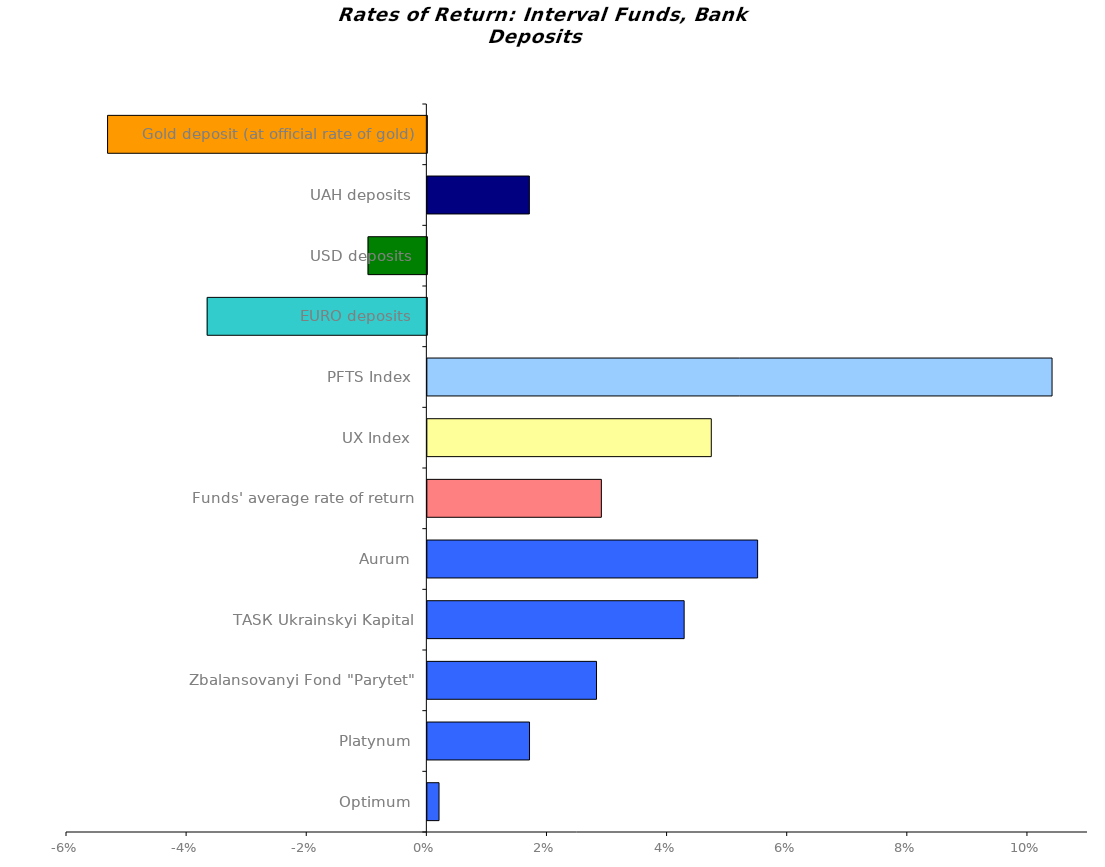
| Category | Series 0 |
|---|---|
| Optimum | 0.002 |
| Platynum | 0.017 |
| Zbalansovanyi Fond "Parytet" | 0.028 |
| ТАSК Ukrainskyi Kapital | 0.043 |
| Аurum | 0.055 |
| Funds' average rate of return | 0.029 |
| UX Index | 0.047 |
| PFTS Index | 0.104 |
| EURO deposits | -0.037 |
| USD deposits | -0.01 |
| UAH deposits | 0.017 |
| Gold deposit (at official rate of gold) | -0.053 |